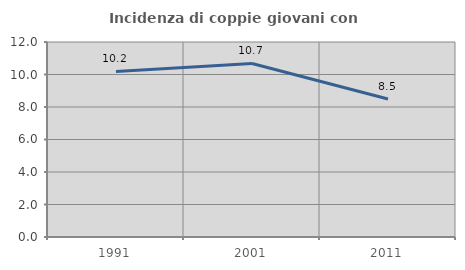
| Category | Incidenza di coppie giovani con figli |
|---|---|
| 1991.0 | 10.185 |
| 2001.0 | 10.68 |
| 2011.0 | 8.491 |